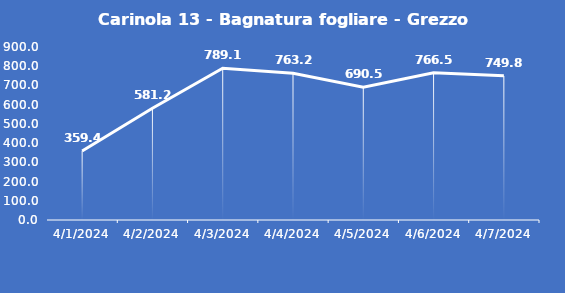
| Category | Carinola 13 - Bagnatura fogliare - Grezzo (min) |
|---|---|
| 4/1/24 | 359.4 |
| 4/2/24 | 581.2 |
| 4/3/24 | 789.1 |
| 4/4/24 | 763.2 |
| 4/5/24 | 690.5 |
| 4/6/24 | 766.5 |
| 4/7/24 | 749.8 |